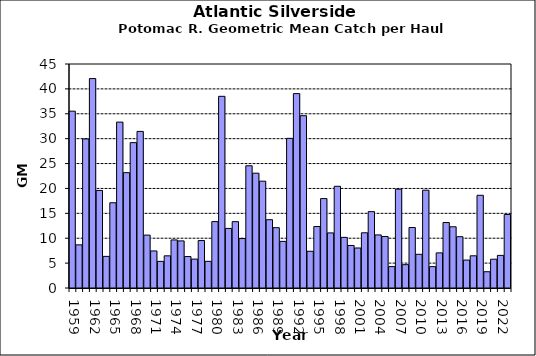
| Category | Series 0 |
|---|---|
| 1959.0 | 35.523 |
| 1960.0 | 8.668 |
| 1961.0 | 29.947 |
| 1962.0 | 42.069 |
| 1963.0 | 19.598 |
| 1964.0 | 6.352 |
| 1965.0 | 17.125 |
| 1966.0 | 33.328 |
| 1967.0 | 23.171 |
| 1968.0 | 29.203 |
| 1969.0 | 31.456 |
| 1970.0 | 10.627 |
| 1971.0 | 7.444 |
| 1972.0 | 5.346 |
| 1973.0 | 6.466 |
| 1974.0 | 9.655 |
| 1975.0 | 9.461 |
| 1976.0 | 6.32 |
| 1977.0 | 5.805 |
| 1978.0 | 9.533 |
| 1979.0 | 5.357 |
| 1980.0 | 13.335 |
| 1981.0 | 38.506 |
| 1982.0 | 11.972 |
| 1983.0 | 13.328 |
| 1984.0 | 9.934 |
| 1985.0 | 24.559 |
| 1986.0 | 23.068 |
| 1987.0 | 21.46 |
| 1988.0 | 13.718 |
| 1989.0 | 12.116 |
| 1990.0 | 9.364 |
| 1991.0 | 30.062 |
| 1992.0 | 39.055 |
| 1993.0 | 34.613 |
| 1994.0 | 7.379 |
| 1995.0 | 12.347 |
| 1996.0 | 17.962 |
| 1997.0 | 11.067 |
| 1998.0 | 20.431 |
| 1999.0 | 10.172 |
| 2000.0 | 8.544 |
| 2001.0 | 8.038 |
| 2002.0 | 11.092 |
| 2003.0 | 15.339 |
| 2004.0 | 10.66 |
| 2005.0 | 10.336 |
| 2006.0 | 4.3 |
| 2007.0 | 19.86 |
| 2008.0 | 4.687 |
| 2009.0 | 12.15 |
| 2010.0 | 6.769 |
| 2011.0 | 19.65 |
| 2012.0 | 4.291 |
| 2013.0 | 7.056 |
| 2014.0 | 13.155 |
| 2015.0 | 12.3 |
| 2016.0 | 10.304 |
| 2017.0 | 5.611 |
| 2018.0 | 6.469 |
| 2019.0 | 18.625 |
| 2020.0 | 3.27 |
| 2021.0 | 5.783 |
| 2022.0 | 6.551 |
| 2023.0 | 14.77 |